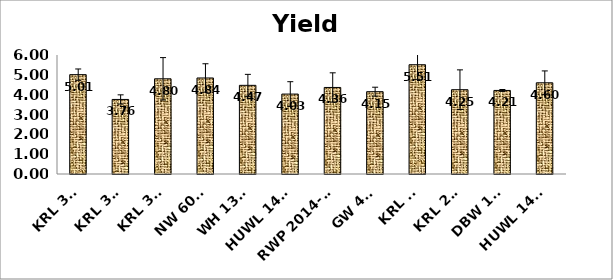
| Category | Yield (t/ha) |
|---|---|
| KRL 345 | 5.009 |
| KRL 347 | 3.759 |
| KRL 351 | 4.8 |
| NW 6096 | 4.841 |
| WH 1309 | 4.47 |
| HUWL 1413 | 4.03 |
| RWP 2014-20 | 4.363 |
| GW 496 | 4.151 |
| KRL 19 | 5.509 |
| KRL 210 | 4.251 |
| DBW 181 | 4.212 |
| HUWL 1412 | 4.599 |